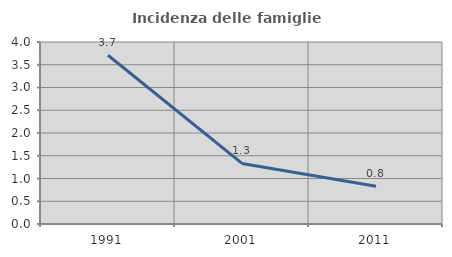
| Category | Incidenza delle famiglie numerose |
|---|---|
| 1991.0 | 3.708 |
| 2001.0 | 1.332 |
| 2011.0 | 0.829 |